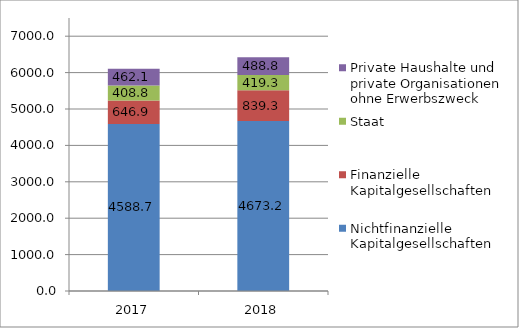
| Category | Nichtfinanzielle Kapitalgesellschaften | Finanzielle Kapitalgesellschaften | Staat | Private Haushalte und private Organisationen ohne Erwerbszweck |
|---|---|---|---|---|
| 2017.0 | 4588.7 | 646.9 | 408.8 | 462.1 |
| 2018.0 | 4673.2 | 839.3 | 419.3 | 488.8 |